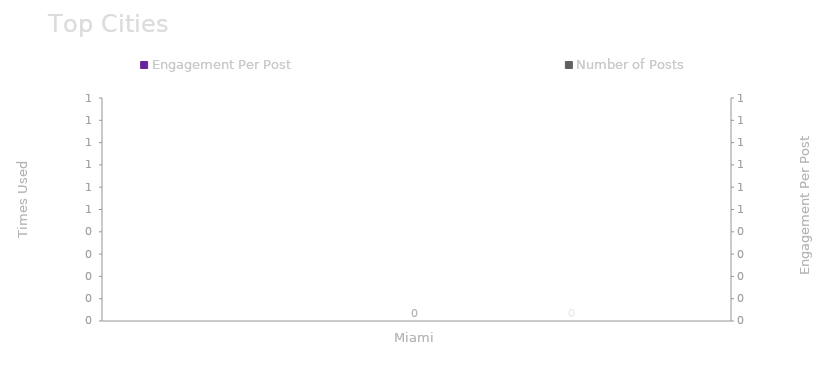
| Category | Engagement Per Post |
|---|---|
| Miami, FL | 115.5 |